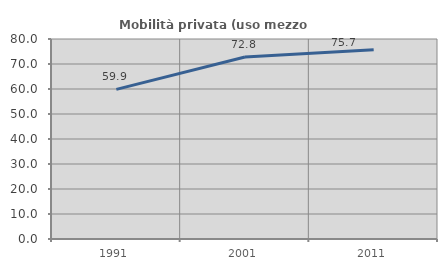
| Category | Mobilità privata (uso mezzo privato) |
|---|---|
| 1991.0 | 59.859 |
| 2001.0 | 72.798 |
| 2011.0 | 75.674 |